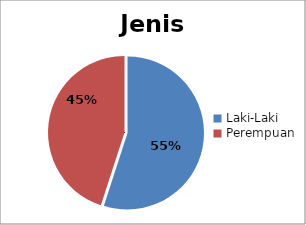
| Category | Jenis Kelamin |
|---|---|
| Laki-Laki | 0.55 |
| Perempuan | 0.45 |